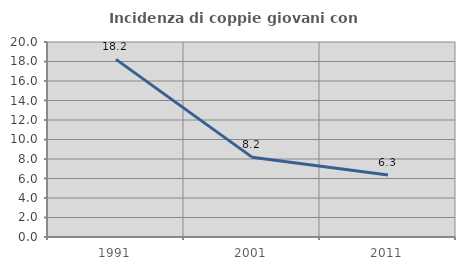
| Category | Incidenza di coppie giovani con figli |
|---|---|
| 1991.0 | 18.219 |
| 2001.0 | 8.19 |
| 2011.0 | 6.349 |